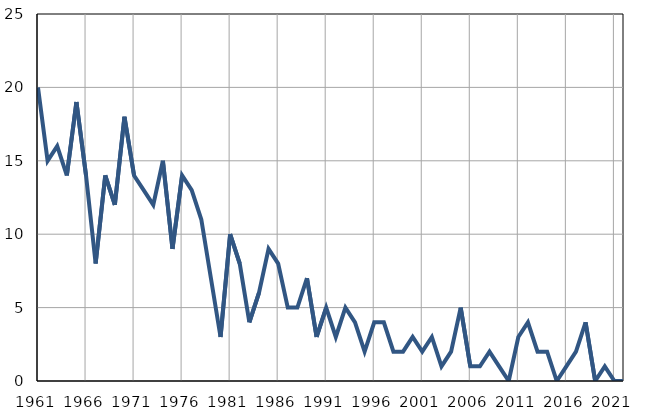
| Category | Infants
deaths |
|---|---|
| 1961.0 | 20 |
| 1962.0 | 15 |
| 1963.0 | 16 |
| 1964.0 | 14 |
| 1965.0 | 19 |
| 1966.0 | 14 |
| 1967.0 | 8 |
| 1968.0 | 14 |
| 1969.0 | 12 |
| 1970.0 | 18 |
| 1971.0 | 14 |
| 1972.0 | 13 |
| 1973.0 | 12 |
| 1974.0 | 15 |
| 1975.0 | 9 |
| 1976.0 | 14 |
| 1977.0 | 13 |
| 1978.0 | 11 |
| 1979.0 | 7 |
| 1980.0 | 3 |
| 1981.0 | 10 |
| 1982.0 | 8 |
| 1983.0 | 4 |
| 1984.0 | 6 |
| 1985.0 | 9 |
| 1986.0 | 8 |
| 1987.0 | 5 |
| 1988.0 | 5 |
| 1989.0 | 7 |
| 1990.0 | 3 |
| 1991.0 | 5 |
| 1992.0 | 3 |
| 1993.0 | 5 |
| 1994.0 | 4 |
| 1995.0 | 2 |
| 1996.0 | 4 |
| 1997.0 | 4 |
| 1998.0 | 2 |
| 1999.0 | 2 |
| 2000.0 | 3 |
| 2001.0 | 2 |
| 2002.0 | 3 |
| 2003.0 | 1 |
| 2004.0 | 2 |
| 2005.0 | 5 |
| 2006.0 | 1 |
| 2007.0 | 1 |
| 2008.0 | 2 |
| 2009.0 | 1 |
| 2010.0 | 0 |
| 2011.0 | 3 |
| 2012.0 | 4 |
| 2013.0 | 2 |
| 2014.0 | 2 |
| 2015.0 | 0 |
| 2016.0 | 1 |
| 2017.0 | 2 |
| 2018.0 | 4 |
| 2019.0 | 0 |
| 2020.0 | 1 |
| 2021.0 | 0 |
| 2022.0 | 0 |